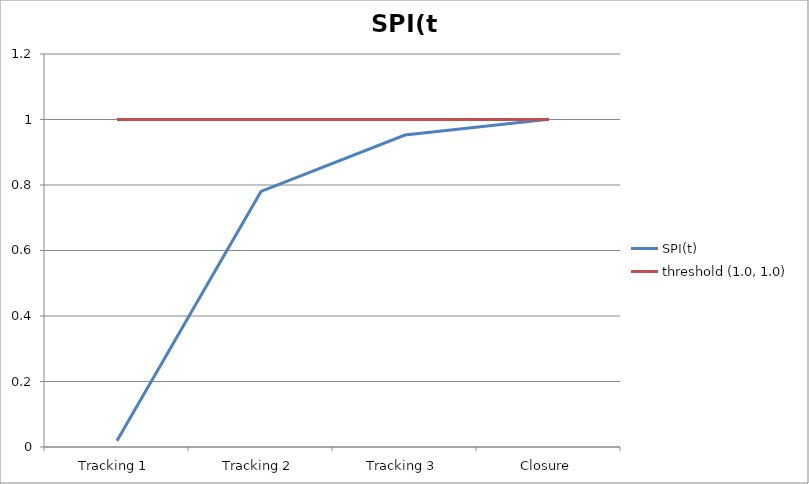
| Category | SPI(t) | threshold (1.0, 1.0) |
|---|---|---|
| Tracking 1 | 0.019 | 1 |
| Tracking 2 | 0.78 | 1 |
| Tracking 3 | 0.953 | 1 |
| Closure | 1.001 | 1 |